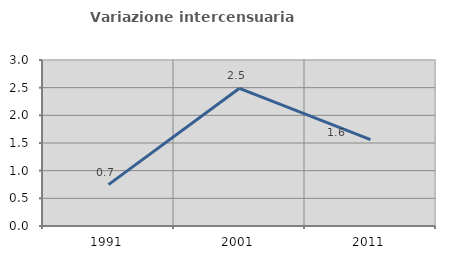
| Category | Variazione intercensuaria annua |
|---|---|
| 1991.0 | 0.748 |
| 2001.0 | 2.488 |
| 2011.0 | 1.56 |